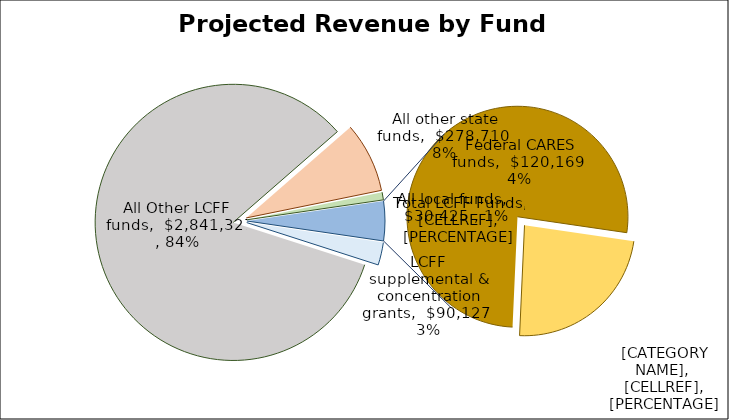
| Category | Series 0 |
|---|---|
| LCFF supplemental & concentration grants | 90127 |
| All Other LCFF funds | 2841327 |
| All other state funds | 278710 |
| All local funds | 30425 |
| All Other Federal Funds | 36716 |
| Federal CARES funds | 120169 |